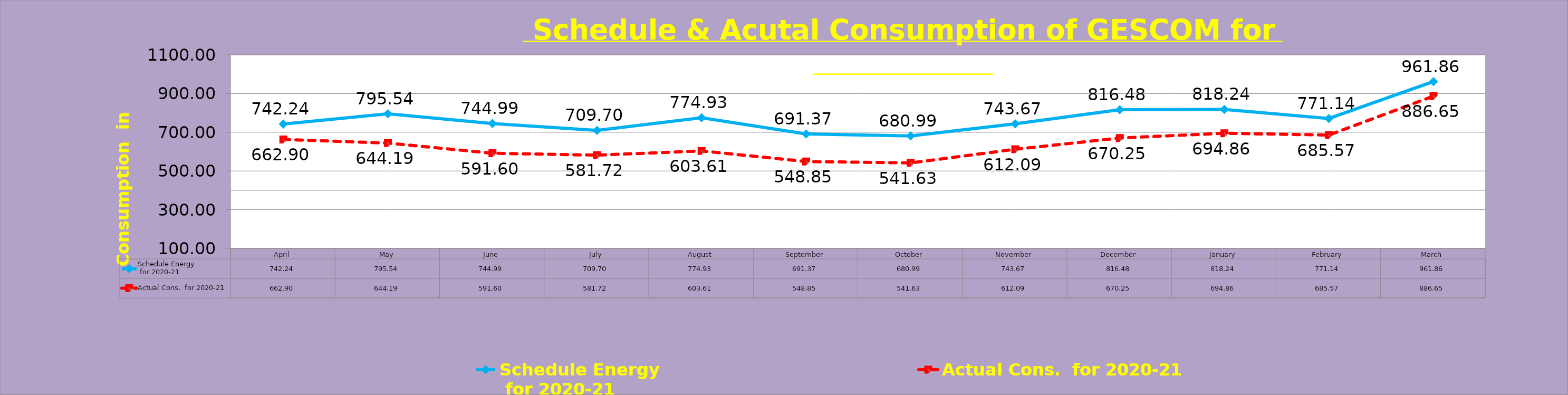
| Category | Schedule Energy           
 for 2020-21 | Actual Cons.  for 2020-21 |
|---|---|---|
| April | 742.24 | 662.901 |
| May | 795.54 | 644.19 |
| June | 744.99 | 591.6 |
| July | 709.7 | 581.72 |
| August | 774.93 | 603.61 |
| September | 691.37 | 548.85 |
| October | 680.99 | 541.63 |
| November | 743.67 | 612.09 |
| December | 816.48 | 670.25 |
| January | 818.24 | 694.86 |
| February | 771.14 | 685.57 |
| March | 961.86 | 886.65 |